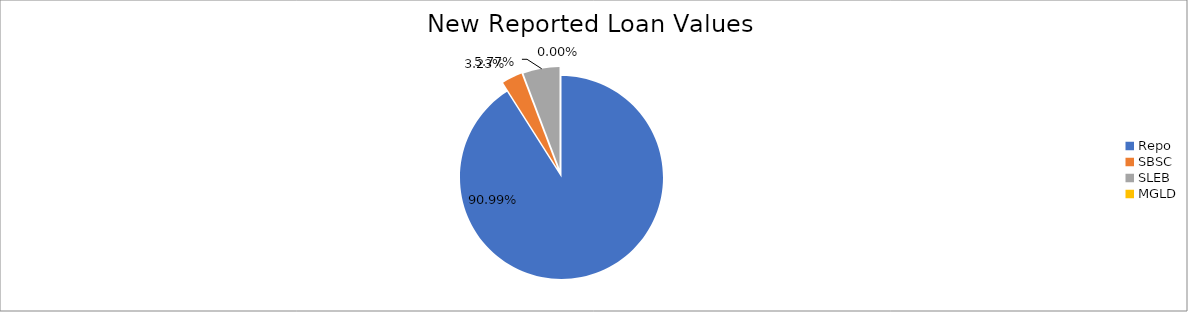
| Category | Series 0 |
|---|---|
| Repo | 8245153.942 |
| SBSC | 293136.679 |
| SLEB | 523200.53 |
| MGLD | 7.009 |